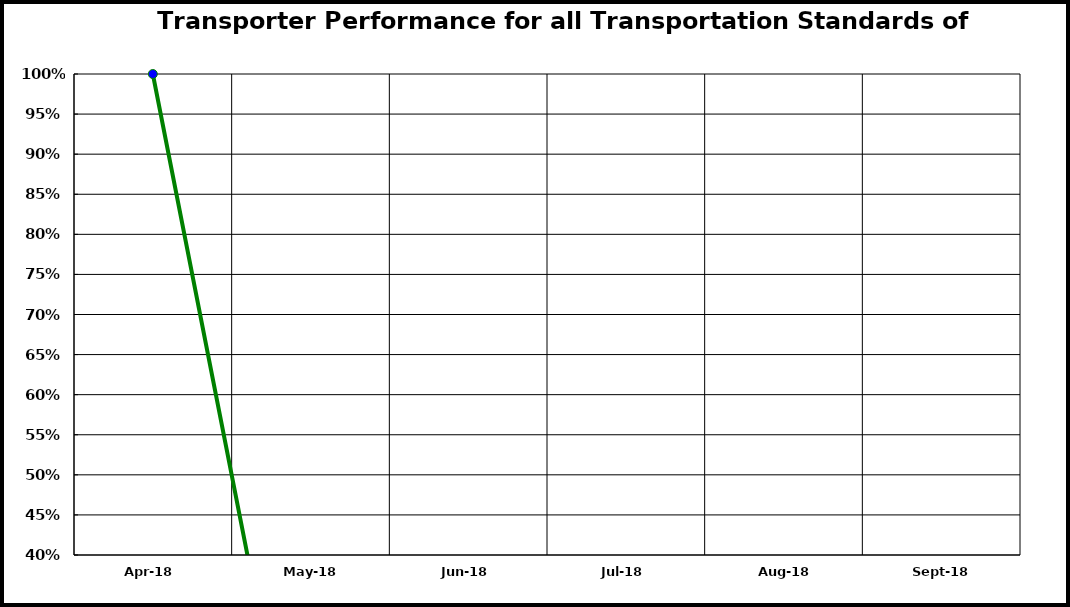
| Category | Performance |
|---|---|
| 2018-04-01 | 1 |
| 2018-05-01 | 0 |
| 2018-06-01 | 0 |
| 2018-07-01 | 0 |
| 2018-08-01 | 0 |
| 2018-09-01 | 0 |